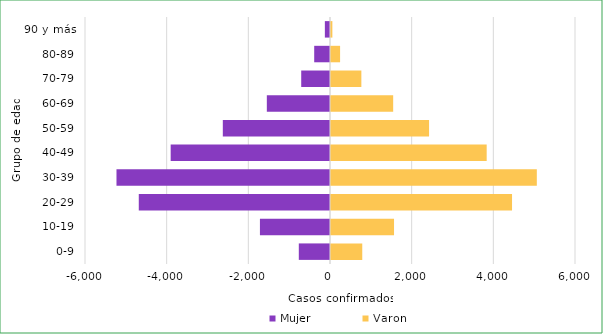
| Category | Mujer | Varon |
|---|---|---|
| 0-9 | -764 | 790 |
| 10-19 | -1716 | 1568 |
| 20-29 | -4683 | 4458 |
| 30-39 | -5229 | 5065 |
| 40-49 | -3902 | 3837 |
| 50-59 | -2625 | 2426 |
| 60-69 | -1547 | 1547 |
| 70-79 | -705 | 768 |
| 80-89 | -387 | 247 |
| 90 y más | -126 | 58 |